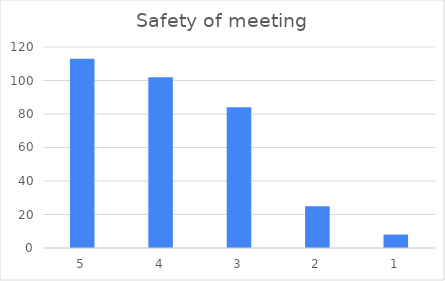
| Category | Series 0 |
|---|---|
| 5 | 113 |
| 4 | 102 |
| 3 | 84 |
| 2 | 25 |
| 1 | 8 |